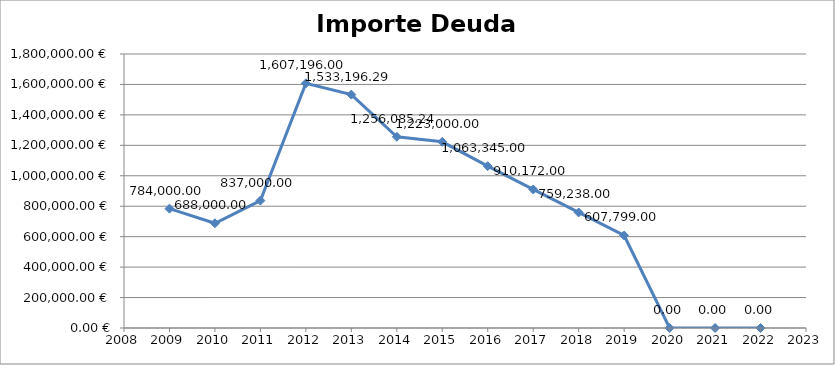
| Category | Importe deuda viva  |
|---|---|
| 2009.0 | 784000 |
| 2010.0 | 688000 |
| 2011.0 | 837000 |
| 2012.0 | 1607196 |
| 2013.0 | 1533196.29 |
| 2014.0 | 1256085.24 |
| 2015.0 | 1223000 |
| 2016.0 | 1063345 |
| 2017.0 | 910172 |
| 2018.0 | 759238 |
| 2019.0 | 607799 |
| 2020.0 | 0 |
| 2021.0 | 0 |
| 2022.0 | 0 |